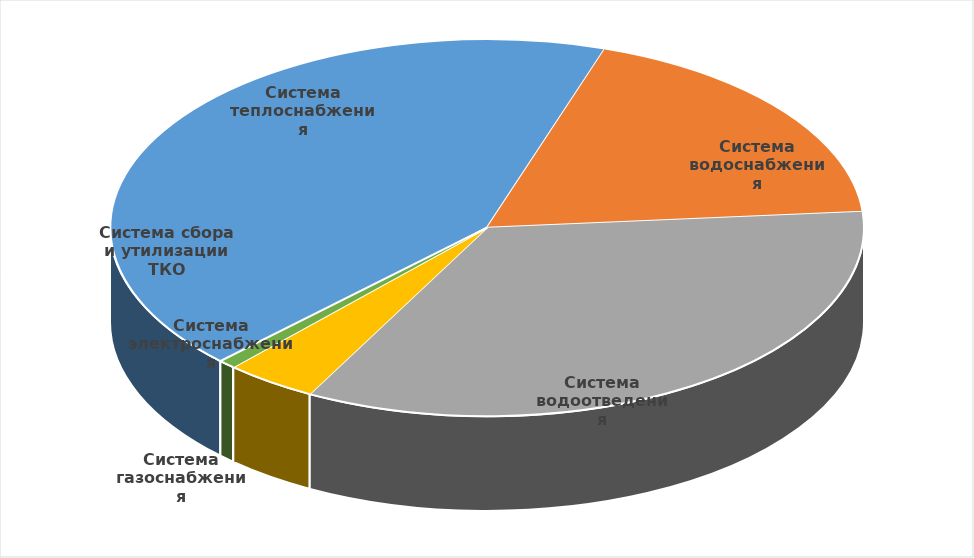
| Category | Потребность в капитальных вложениях, в т.ч.: |
|---|---|
| Система теплоснабжения | 4081834 |
| Система водоснабжения | 1782385.459 |
| Система водоотведения | 3272778.981 |
| Система электроснабжения | 379422.302 |
| Система газоснабжения | 0 |
| Система сбора и утилизации ТКО | 72200 |